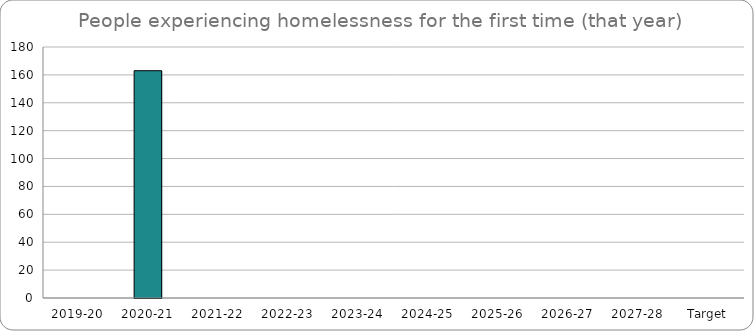
| Category | Series 0 |
|---|---|
| 2019-20 | 0 |
| 2020-21 | 163 |
| 2021-22 | 0 |
| 2022-23 | 0 |
| 2023-24 | 0 |
| 2024-25 | 0 |
| 2025-26 | 0 |
| 2026-27 | 0 |
| 2027-28 | 0 |
| Target | 0 |